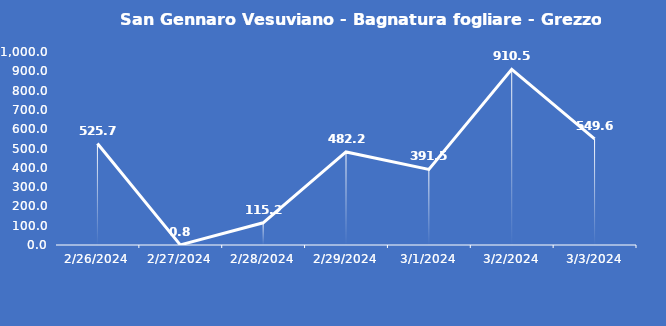
| Category | San Gennaro Vesuviano - Bagnatura fogliare - Grezzo (min) |
|---|---|
| 2/26/24 | 525.7 |
| 2/27/24 | 0.8 |
| 2/28/24 | 115.2 |
| 2/29/24 | 482.2 |
| 3/1/24 | 391.5 |
| 3/2/24 | 910.5 |
| 3/3/24 | 549.6 |